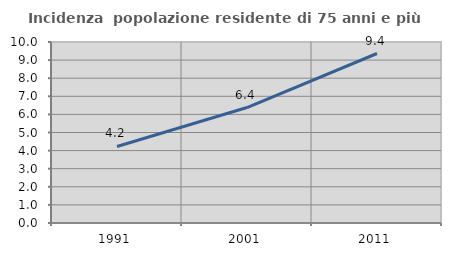
| Category | Incidenza  popolazione residente di 75 anni e più |
|---|---|
| 1991.0 | 4.227 |
| 2001.0 | 6.38 |
| 2011.0 | 9.365 |